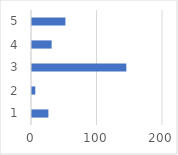
| Category | Series 0 |
|---|---|
| 0 | 25 |
| 1 | 5 |
| 2 | 144 |
| 3 | 30 |
| 4 | 51 |